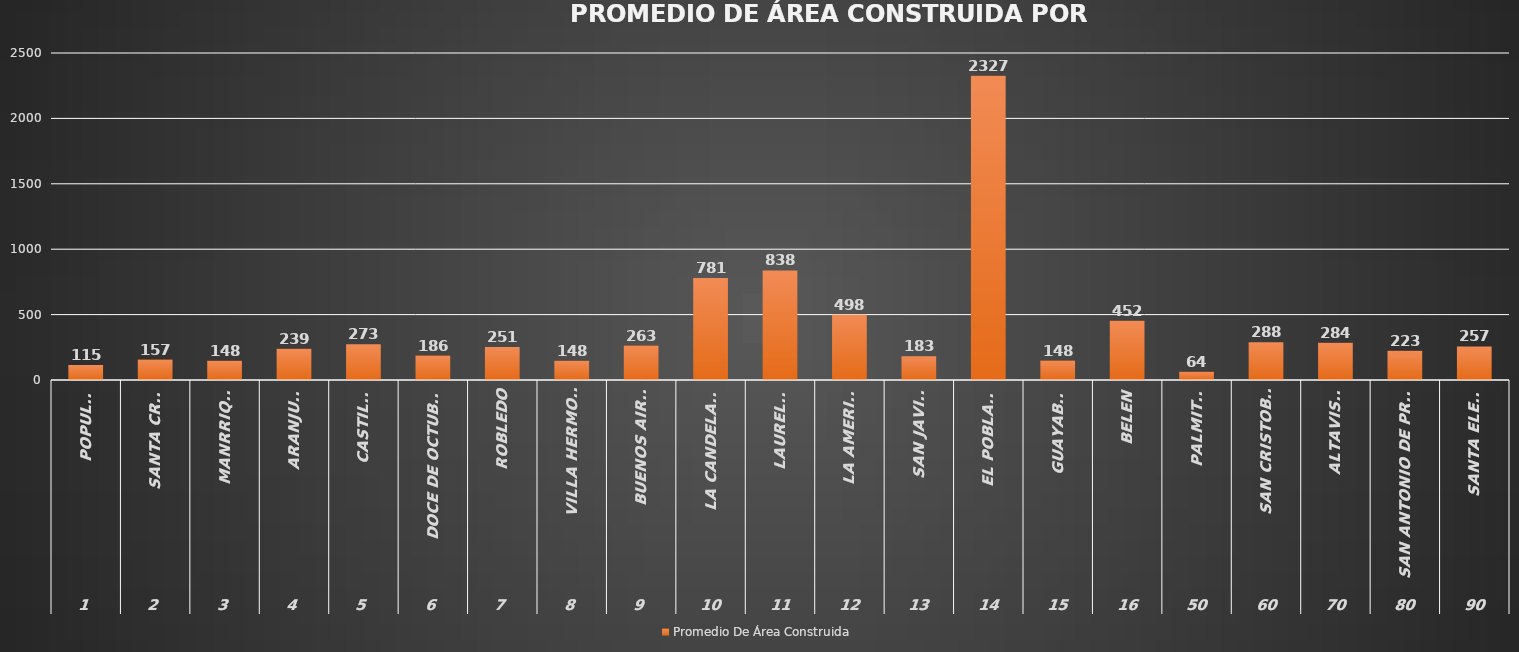
| Category | Promedio De Área Construida |
|---|---|
| 0 | 114.668 |
| 1 | 156.658 |
| 2 | 147.51 |
| 3 | 238.85 |
| 4 | 272.706 |
| 5 | 186.393 |
| 6 | 251.349 |
| 7 | 147.548 |
| 8 | 263.275 |
| 9 | 780.576 |
| 10 | 837.763 |
| 11 | 498.197 |
| 12 | 182.505 |
| 13 | 2326.556 |
| 14 | 148.374 |
| 15 | 452.357 |
| 16 | 63.826 |
| 17 | 287.897 |
| 18 | 284.024 |
| 19 | 223.335 |
| 20 | 256.736 |